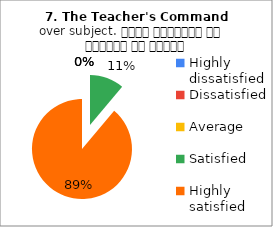
| Category | 7. The Teacher's Command over subject. विषय अवधारणा पर शिक्षक का ज्ञान |
|---|---|
| Highly dissatisfied | 0 |
| Dissatisfied | 0 |
| Average | 0 |
| Satisfied | 4 |
| Highly satisfied | 32 |